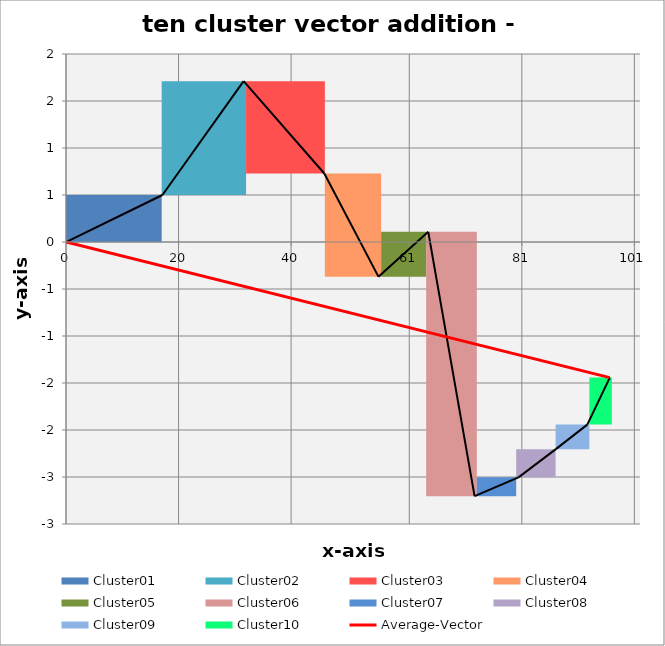
| Category | transparent | Cluster01 | Cluster02 | Cluster03 | Cluster04 | Cluster05 | Cluster06 | Cluster07 | Cluster08 | Cluster09 | Cluster10 | Border right & top |
|---|---|---|---|---|---|---|---|---|---|---|---|---|
| 0.0 | 0 | 0.5 | 0 | 0 | 0 | 0 | 0 | 0 | 0 | 0 | 0 | 0 |
| 17.138 | 0 | 0.5 | 0 | 0 | 0 | 0 | 0 | 0 | 0 | 0 | 0 | 0 |
| 17.138 | 0.5 | 0 | 1.211 | 0 | 0 | 0 | 0 | 0 | 0 | 0 | 0 | 0 |
| 31.565 | 0.5 | 0 | 1.211 | 0 | 0 | 0 | 0 | 0 | 0 | 0 | 0 | 0 |
| 31.565 | 1.711 | 0 | 0 | -0.983 | 0 | 0 | 0 | 0 | 0 | 0 | 0 | 0 |
| 45.905 | 1.711 | 0 | 0 | -0.983 | 0 | 0 | 0 | 0 | 0 | 0 | 0 | 0 |
| 45.905 | 0.728 | 0 | 0 | 0 | -1.097 | 0 | 0 | 0 | 0 | 0 | 0 | 0 |
| 55.521 | 0.728 | 0 | 0 | 0 | -1.097 | 0 | 0 | 0 | 0 | 0 | 0 | 0 |
| 55.521 | -0.369 | 0 | 0 | 0 | 0 | 0.477 | 0 | 0 | 0 | 0 | 0 | 0 |
| 64.37 | -0.369 | 0 | 0 | 0 | 0 | 0.477 | 0 | 0 | 0 | 0 | 0 | 0 |
| 64.37 | 0.108 | 0 | 0 | 0 | 0 | 0 | -2.812 | 0 | 0 | 0 | 0 | 0 |
| 72.605 | 0.108 | 0 | 0 | 0 | 0 | 0 | -2.812 | 0 | 0 | 0 | 0 | 0 |
| 72.605 | -2.704 | 0 | 0 | 0 | 0 | 0 | 0 | 0.2 | 0 | 0 | 0 | 0 |
| 80.4066 | -2.704 | 0 | 0 | 0 | 0 | 0 | 0 | 0.2 | 0 | 0 | 0 | 0 |
| 80.4066 | -2.504 | 0 | 0 | 0 | 0 | 0 | 0 | 0 | 0.3 | 0 | 0 | 0 |
| 87.0436 | -2.504 | 0 | 0 | 0 | 0 | 0 | 0 | 0 | 0.3 | 0 | 0 | 0 |
| 87.0436 | -2.204 | 0 | 0 | 0 | 0 | 0 | 0 | 0 | 0 | 0.261 | 0 | 0 |
| 92.63499999999999 | -2.204 | 0 | 0 | 0 | 0 | 0 | 0 | 0 | 0 | 0.261 | 0 | 0 |
| 92.63499999999999 | -1.943 | 0 | 0 | 0 | 0 | 0 | 0 | 0 | 0 | 0 | 0.5 | 0 |
| 96.63499999999999 | -1.943 | 0 | 0 | 0 | 0 | 0 | 0 | 0 | 0 | 0 | 0.5 | 0 |
| 96.63499999999999 | -1.443 | 0 | 0 | 0 | 0 | 0 | 0 | 0 | 0 | 0 | 0 | 0 |
| 101.63499999999999 | -1.443 | 0 | 0 | 0 | 0 | 0 | 0 | 0 | 0 | 0 | 0 | 0 |
| 101.63499999999999 | -1.443 | 0 | 0 | 0 | 0 | 0 | 0 | 0 | 0 | 0 | 0 | 0 |